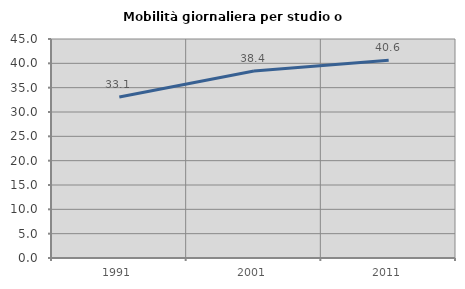
| Category | Mobilità giornaliera per studio o lavoro |
|---|---|
| 1991.0 | 33.097 |
| 2001.0 | 38.422 |
| 2011.0 | 40.613 |